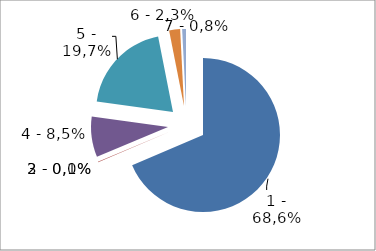
| Category | 1 – недоимка 2 – реструктурированная задолженность 3 –отсроченные (рассроченные) платежи 4 – задолженность, приостановленная к взысканию в связи с введением процедур банкротства 5 – задолженность, взыскиваемая судебными приставами, по постановлениям о воз |
|---|---|
| 1 – недоимка | 0.686 |
| 2 – реструктурированная задолженность | 0.001 |
| 3 –отсроченные (рассроченные) платежи | 0 |
| 4 – задолженность, приостановленная к взысканию в связи с введением процедур банкротства | 0.085 |
| 5 – задолженность, взыскиваемая судебными приставами, по постановлениям о возбуждении исполнительного производства | 0.197 |
| 6 – приостановленные к взысканию платежи | 0.023 |
| 7– задолженность, невозможная к взысканию налоговыми органами (без зависших платежей) | 0.008 |